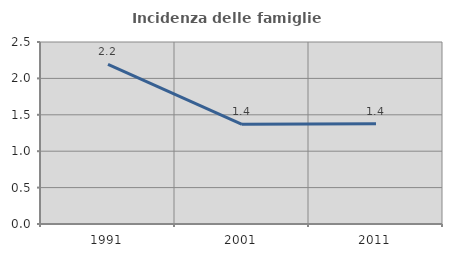
| Category | Incidenza delle famiglie numerose |
|---|---|
| 1991.0 | 2.193 |
| 2001.0 | 1.37 |
| 2011.0 | 1.376 |